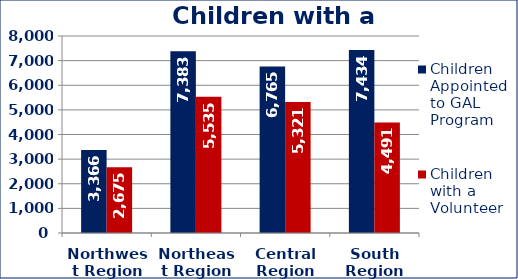
| Category | Children Appointed to GAL Program  | Children with a Volunteer  |
|---|---|---|
| Northwest Region | 3366 | 2675 |
| Northeast Region | 7383 | 5535 |
| Central Region | 6765 | 5321 |
| South Region | 7434 | 4491 |